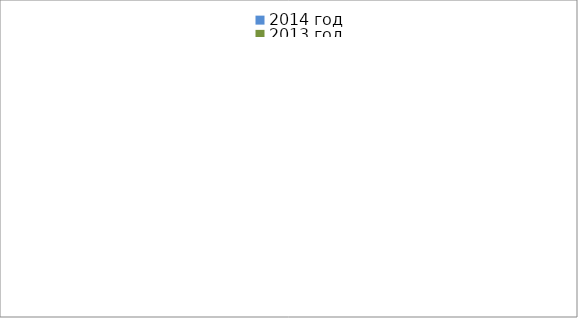
| Category | 2014 год | 2013 год |
|---|---|---|
|  - поджог | 10 | 22 |
|  - неосторожное обращение с огнём | 24 | 30 |
|  - НПТЭ электрооборудования | 12 | 18 |
|  - НПУ и Э печей | 46 | 34 |
|  - НПУ и Э транспортных средств | 44 | 44 |
|   -Шалость с огнем детей | 0 | 3 |
|  -НППБ при эксплуатации эл.приборов | 16 | 19 |
|  - курение | 11 | 9 |
| - прочие | 58 | 53 |
| - не установленные причины | 9 | 1 |